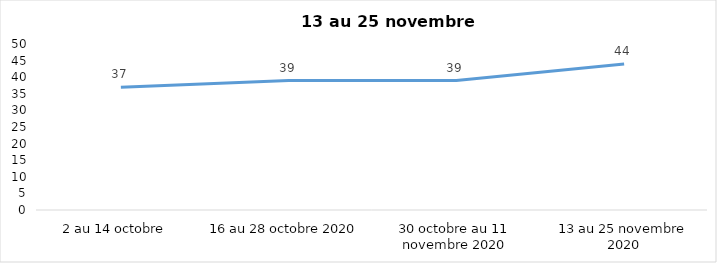
| Category | Series 0 |
|---|---|
| 2 au 14 octobre  | 37 |
| 16 au 28 octobre 2020 | 39 |
| 30 octobre au 11 novembre 2020 | 39 |
| 13 au 25 novembre 2020 | 44 |